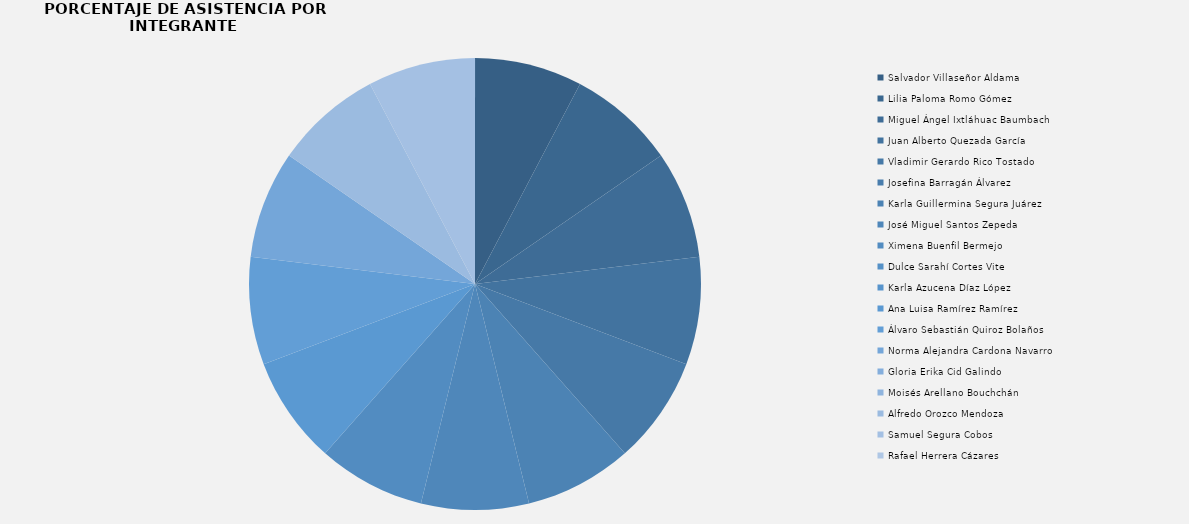
| Category | Salvador Villaseñor Aldama  |
|---|---|
| Salvador Villaseñor Aldama  | 1 |
| Lilia Paloma Romo Gómez  | 1 |
| Miguel Ángel Ixtláhuac Baumbach  | 1 |
| Juan Alberto Quezada García  | 1 |
| Vladimir Gerardo Rico Tostado | 1 |
| Josefina Barragán Álvarez  | 0 |
| Karla Guillermina Segura Juárez | 1 |
| José Miguel Santos Zepeda  | 1 |
| Ximena Buenfil Bermejo | 1 |
| Dulce Sarahí Cortes Vite  | 0 |
| Karla Azucena Díaz López  | 0 |
| Ana Luisa Ramírez Ramírez | 1 |
| Álvaro Sebastián Quiroz Bolaños | 1 |
| Norma Alejandra Cardona Navarro  | 1 |
| Gloria Erika Cid Galindo  | 0 |
| Moisés Arellano Bouchchán | 0 |
| Alfredo Orozco Mendoza  | 1 |
| Samuel Segura Cobos  | 1 |
| Rafael Herrera Cázares | 0 |